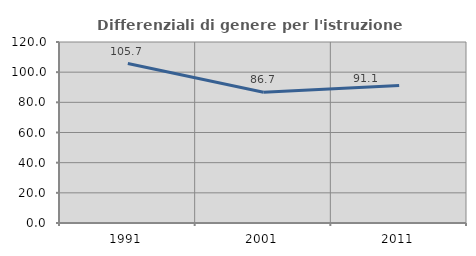
| Category | Differenziali di genere per l'istruzione superiore |
|---|---|
| 1991.0 | 105.73 |
| 2001.0 | 86.703 |
| 2011.0 | 91.105 |